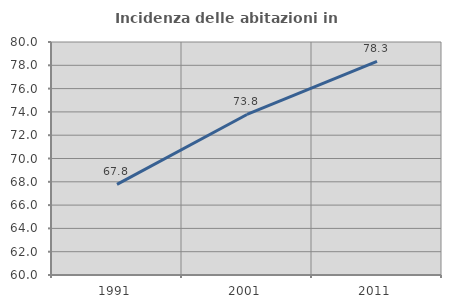
| Category | Incidenza delle abitazioni in proprietà  |
|---|---|
| 1991.0 | 67.774 |
| 2001.0 | 73.778 |
| 2011.0 | 78.345 |